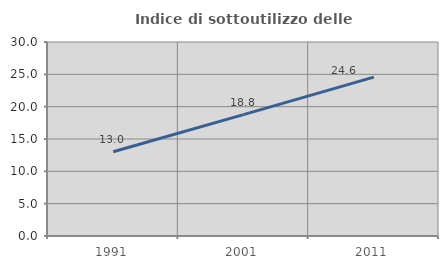
| Category | Indice di sottoutilizzo delle abitazioni  |
|---|---|
| 1991.0 | 13.033 |
| 2001.0 | 18.766 |
| 2011.0 | 24.573 |